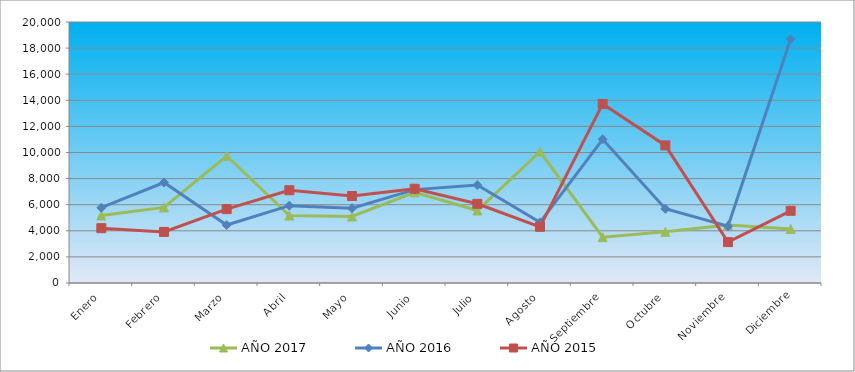
| Category | AÑO 2017 | AÑO 2016 | AÑO 2015 |
|---|---|---|---|
| Enero | 5173.072 | 5768.907 | 4199.631 |
| Febrero | 5793.473 | 7702.309 | 3915.17 |
| Marzo | 9731.603 | 4440.622 | 5660.374 |
| Abril | 5168.69 | 5926.147 | 7107.41 |
| Mayo | 5094.681 | 5730.468 | 6665.472 |
| Junio | 6946.727 | 7156.2 | 7223.123 |
| Julio | 5556.793 | 7506.259 | 6068.438 |
| Agosto | 10072.823 | 4647.307 | 4300.898 |
| Septiembre | 3508.094 | 11015.129 | 13724.079 |
| Octubre | 3918.586 | 5687.84 | 10545.504 |
| Noviembre | 4441.687 | 4347.659 | 3133.597 |
| Diciembre | 4145.567 | 18694.787 | 5533.474 |